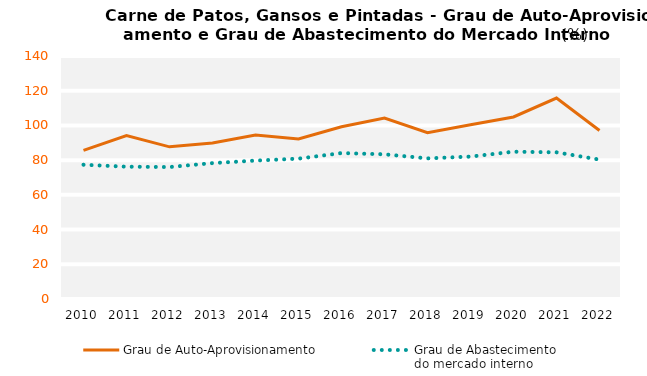
| Category | Grau de Auto-Aprovisionamento | Grau de Abastecimento
do mercado interno |
|---|---|---|
| 2010.0 | 85.612 | 77.346 |
| 2011.0 | 94.185 | 76.219 |
| 2012.0 | 87.663 | 76.015 |
| 2013.0 | 89.863 | 78.302 |
| 2014.0 | 94.494 | 79.738 |
| 2015.0 | 92.166 | 80.863 |
| 2016.0 | 99.243 | 84.07 |
| 2017.0 | 104.262 | 83.368 |
| 2018.0 | 95.846 | 81.018 |
| 2019.0 | 100.409 | 82.053 |
| 2020.0 | 104.881 | 84.859 |
| 2021.0 | 115.758 | 84.499 |
| 2022.0 | 97.076 | 80.298 |